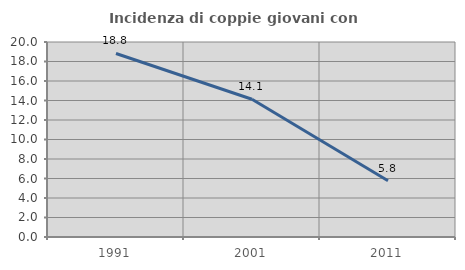
| Category | Incidenza di coppie giovani con figli |
|---|---|
| 1991.0 | 18.824 |
| 2001.0 | 14.13 |
| 2011.0 | 5.769 |